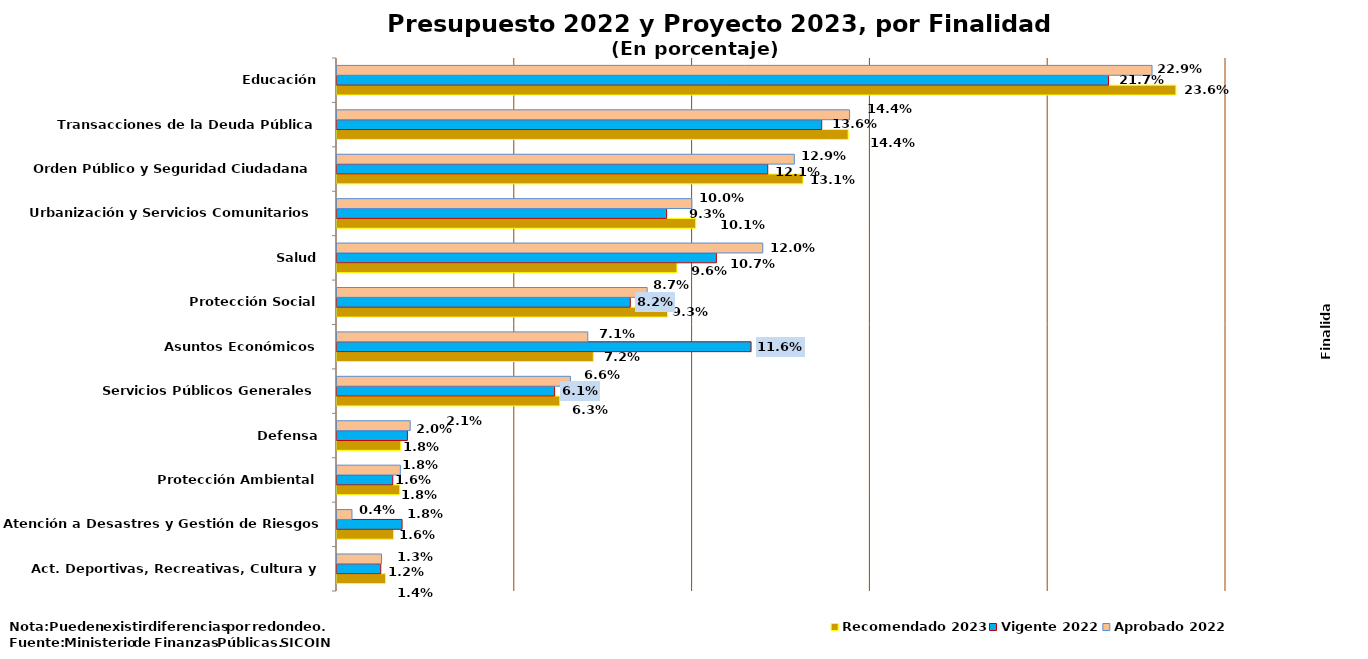
| Category | Recomendado 2023 | Vigente 2022 | Aprobado 2022 |
|---|---|---|---|
| Act. Deportivas, Recreativas, Cultura y Religión | 0.014 | 0.012 | 0.013 |
| Atención a Desastres y Gestión de Riesgos | 0.016 | 0.018 | 0.004 |
| Protección Ambiental | 0.018 | 0.016 | 0.018 |
| Defensa | 0.018 | 0.02 | 0.021 |
| Servicios Públicos Generales | 0.063 | 0.061 | 0.066 |
| Asuntos Económicos | 0.072 | 0.116 | 0.071 |
| Protección Social | 0.093 | 0.082 | 0.087 |
| Salud | 0.096 | 0.107 | 0.12 |
| Urbanización y Servicios Comunitarios | 0.101 | 0.093 | 0.1 |
| Orden Público y Seguridad Ciudadana | 0.131 | 0.121 | 0.129 |
| Transacciones de la Deuda Pública | 0.144 | 0.136 | 0.144 |
| Educación | 0.236 | 0.217 | 0.229 |